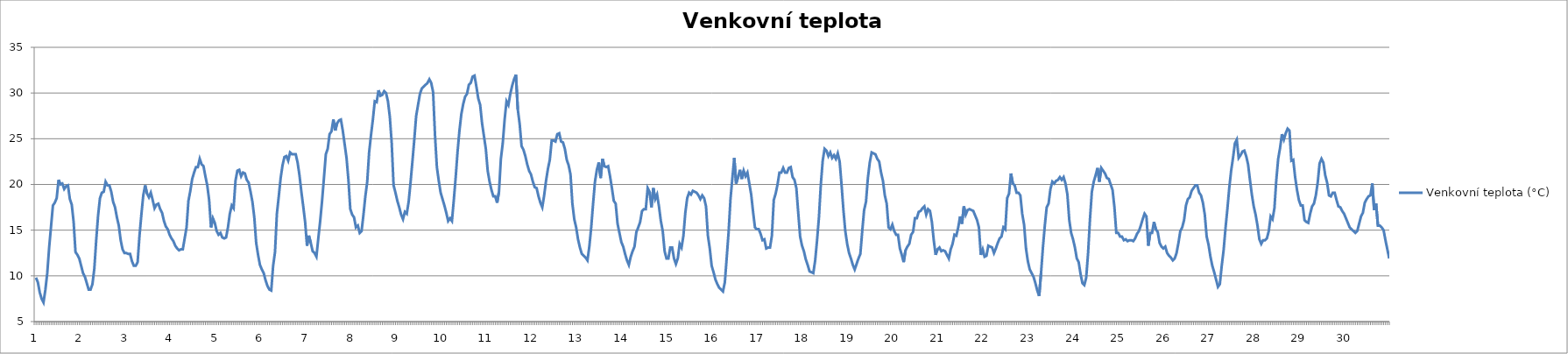
| Category | Venkovní teplota (°C) |
|---|---|
| 0 | 9.8 |
| 1 | 9.3 |
| 2 | 8.2 |
| 3 | 7.5 |
| 4 | 7.1 |
| 5 | 8.5 |
| 6 | 10.3 |
| 7 | 13.1 |
| 8 | 15.4 |
| 9 | 17.7 |
| 10 | 18 |
| 11 | 18.5 |
| 12 | 20.5 |
| 13 | 20 |
| 14 | 20.1 |
| 15 | 19.5 |
| 16 | 19.8 |
| 17 | 19.9 |
| 18 | 18.4 |
| 19 | 17.8 |
| 20 | 15.9 |
| 21 | 12.6 |
| 22 | 12.3 |
| 23 | 11.9 |
| 24 | 11.1 |
| 25 | 10.3 |
| 26 | 9.9 |
| 27 | 9.2 |
| 28 | 8.5 |
| 29 | 8.5 |
| 30 | 9.1 |
| 31 | 10.8 |
| 32 | 13.9 |
| 33 | 16.6 |
| 34 | 18.5 |
| 35 | 19.1 |
| 36 | 19.2 |
| 37 | 20.3 |
| 38 | 19.9 |
| 39 | 19.9 |
| 40 | 19.2 |
| 41 | 18.1 |
| 42 | 17.5 |
| 43 | 16.4 |
| 44 | 15.5 |
| 45 | 13.9 |
| 46 | 12.9 |
| 47 | 12.5 |
| 48 | 12.5 |
| 49 | 12.4 |
| 50 | 12.4 |
| 51 | 11.6 |
| 52 | 11.1 |
| 53 | 11.1 |
| 54 | 11.5 |
| 55 | 14.4 |
| 56 | 16.7 |
| 57 | 18.8 |
| 58 | 19.9 |
| 59 | 19 |
| 60 | 18.6 |
| 61 | 19.1 |
| 62 | 18.3 |
| 63 | 17.4 |
| 64 | 17.8 |
| 65 | 17.9 |
| 66 | 17.3 |
| 67 | 16.9 |
| 68 | 16 |
| 69 | 15.4 |
| 70 | 15.1 |
| 71 | 14.5 |
| 72 | 14.1 |
| 73 | 13.8 |
| 74 | 13.3 |
| 75 | 13 |
| 76 | 12.8 |
| 77 | 12.9 |
| 78 | 12.9 |
| 79 | 14.1 |
| 80 | 15.3 |
| 81 | 18.2 |
| 82 | 19.3 |
| 83 | 20.6 |
| 84 | 21.3 |
| 85 | 21.9 |
| 86 | 21.9 |
| 87 | 22.8 |
| 88 | 22.2 |
| 89 | 22 |
| 90 | 20.9 |
| 91 | 19.9 |
| 92 | 18.3 |
| 93 | 15.3 |
| 94 | 16.3 |
| 95 | 15.8 |
| 96 | 14.9 |
| 97 | 14.5 |
| 98 | 14.7 |
| 99 | 14.2 |
| 100 | 14.1 |
| 101 | 14.2 |
| 102 | 15.3 |
| 103 | 16.8 |
| 104 | 17.7 |
| 105 | 17.4 |
| 106 | 20.4 |
| 107 | 21.5 |
| 108 | 21.6 |
| 109 | 20.9 |
| 110 | 21.3 |
| 111 | 21.2 |
| 112 | 20.5 |
| 113 | 20.2 |
| 114 | 19.2 |
| 115 | 18.1 |
| 116 | 16.4 |
| 117 | 13.6 |
| 118 | 12.3 |
| 119 | 11.2 |
| 120 | 10.7 |
| 121 | 10.3 |
| 122 | 9.5 |
| 123 | 8.9 |
| 124 | 8.5 |
| 125 | 8.4 |
| 126 | 11.1 |
| 127 | 12.6 |
| 128 | 16.8 |
| 129 | 18.7 |
| 130 | 20.7 |
| 131 | 22.1 |
| 132 | 23 |
| 133 | 23.1 |
| 134 | 22.6 |
| 135 | 23.5 |
| 136 | 23.3 |
| 137 | 23.3 |
| 138 | 23.3 |
| 139 | 22.4 |
| 140 | 21 |
| 141 | 19.2 |
| 142 | 17.6 |
| 143 | 15.9 |
| 144 | 13.3 |
| 145 | 14.4 |
| 146 | 13.6 |
| 147 | 12.7 |
| 148 | 12.5 |
| 149 | 12.1 |
| 150 | 14.1 |
| 151 | 16 |
| 152 | 18.2 |
| 153 | 20.7 |
| 154 | 23.3 |
| 155 | 23.9 |
| 156 | 25.5 |
| 157 | 25.8 |
| 158 | 27.1 |
| 159 | 25.9 |
| 160 | 26.7 |
| 161 | 27 |
| 162 | 27.1 |
| 163 | 25.9 |
| 164 | 24.4 |
| 165 | 22.9 |
| 166 | 20.5 |
| 167 | 17.3 |
| 168 | 16.7 |
| 169 | 16.4 |
| 170 | 15.3 |
| 171 | 15.5 |
| 172 | 14.7 |
| 173 | 14.9 |
| 174 | 16.7 |
| 175 | 18.7 |
| 176 | 20.3 |
| 177 | 23.5 |
| 178 | 25.4 |
| 179 | 27.1 |
| 180 | 29.1 |
| 181 | 29 |
| 182 | 30.3 |
| 183 | 29.7 |
| 184 | 29.8 |
| 185 | 30.2 |
| 186 | 30 |
| 187 | 29.1 |
| 188 | 27.4 |
| 189 | 24.5 |
| 190 | 19.9 |
| 191 | 19.1 |
| 192 | 18.2 |
| 193 | 17.5 |
| 194 | 16.7 |
| 195 | 16.2 |
| 196 | 17 |
| 197 | 16.8 |
| 198 | 18.1 |
| 199 | 20.2 |
| 200 | 22.5 |
| 201 | 24.9 |
| 202 | 27.5 |
| 203 | 28.7 |
| 204 | 29.9 |
| 205 | 30.5 |
| 206 | 30.7 |
| 207 | 30.9 |
| 208 | 31.1 |
| 209 | 31.5 |
| 210 | 31.1 |
| 211 | 30.1 |
| 212 | 25.4 |
| 213 | 21.9 |
| 214 | 20.4 |
| 215 | 19.1 |
| 216 | 18.4 |
| 217 | 17.7 |
| 218 | 16.9 |
| 219 | 16 |
| 220 | 16.3 |
| 221 | 16 |
| 222 | 18.3 |
| 223 | 20.8 |
| 224 | 23.6 |
| 225 | 25.9 |
| 226 | 27.7 |
| 227 | 28.8 |
| 228 | 29.6 |
| 229 | 29.9 |
| 230 | 30.9 |
| 231 | 31.1 |
| 232 | 31.8 |
| 233 | 31.9 |
| 234 | 30.7 |
| 235 | 29.4 |
| 236 | 28.7 |
| 237 | 26.7 |
| 238 | 25.3 |
| 239 | 23.9 |
| 240 | 21.5 |
| 241 | 20.3 |
| 242 | 19.4 |
| 243 | 18.7 |
| 244 | 18.7 |
| 245 | 18 |
| 246 | 19.2 |
| 247 | 22.8 |
| 248 | 24.5 |
| 249 | 27.1 |
| 250 | 29.1 |
| 251 | 28.7 |
| 252 | 29.9 |
| 253 | 30.8 |
| 254 | 31.5 |
| 255 | 32 |
| 256 | 28.2 |
| 257 | 26.6 |
| 258 | 24.2 |
| 259 | 23.8 |
| 260 | 23.1 |
| 261 | 22.2 |
| 262 | 21.5 |
| 263 | 21.1 |
| 264 | 20.3 |
| 265 | 19.7 |
| 266 | 19.6 |
| 267 | 18.7 |
| 268 | 18 |
| 269 | 17.5 |
| 270 | 18.8 |
| 271 | 20.4 |
| 272 | 21.7 |
| 273 | 22.7 |
| 274 | 24.8 |
| 275 | 24.8 |
| 276 | 24.7 |
| 277 | 25.5 |
| 278 | 25.6 |
| 279 | 24.7 |
| 280 | 24.6 |
| 281 | 23.9 |
| 282 | 22.7 |
| 283 | 22.1 |
| 284 | 21.1 |
| 285 | 17.9 |
| 286 | 16.2 |
| 287 | 15.3 |
| 288 | 14 |
| 289 | 13.1 |
| 290 | 12.4 |
| 291 | 12.2 |
| 292 | 12 |
| 293 | 11.7 |
| 294 | 13.2 |
| 295 | 15.3 |
| 296 | 17.9 |
| 297 | 20.3 |
| 298 | 21.6 |
| 299 | 22.4 |
| 300 | 20.7 |
| 301 | 22.8 |
| 302 | 22 |
| 303 | 21.9 |
| 304 | 22 |
| 305 | 20.9 |
| 306 | 19.6 |
| 307 | 18.2 |
| 308 | 17.9 |
| 309 | 15.7 |
| 310 | 14.7 |
| 311 | 13.7 |
| 312 | 13.2 |
| 313 | 12.4 |
| 314 | 11.7 |
| 315 | 11.2 |
| 316 | 12.1 |
| 317 | 12.7 |
| 318 | 13.2 |
| 319 | 14.8 |
| 320 | 15.3 |
| 321 | 15.9 |
| 322 | 17.1 |
| 323 | 17.3 |
| 324 | 17.3 |
| 325 | 19.6 |
| 326 | 19.2 |
| 327 | 17.5 |
| 328 | 19.6 |
| 329 | 18.4 |
| 330 | 18.9 |
| 331 | 17.6 |
| 332 | 16 |
| 333 | 14.9 |
| 334 | 12.7 |
| 335 | 11.9 |
| 336 | 11.9 |
| 337 | 13.1 |
| 338 | 13.1 |
| 339 | 11.9 |
| 340 | 11.3 |
| 341 | 11.9 |
| 342 | 13.5 |
| 343 | 13.1 |
| 344 | 14.4 |
| 345 | 16.9 |
| 346 | 18.5 |
| 347 | 19.1 |
| 348 | 18.9 |
| 349 | 19.3 |
| 350 | 19.2 |
| 351 | 19.1 |
| 352 | 18.8 |
| 353 | 18.4 |
| 354 | 18.8 |
| 355 | 18.5 |
| 356 | 17.6 |
| 357 | 14.4 |
| 358 | 13 |
| 359 | 11.1 |
| 360 | 10.4 |
| 361 | 9.6 |
| 362 | 9.1 |
| 363 | 8.7 |
| 364 | 8.5 |
| 365 | 8.3 |
| 366 | 9.3 |
| 367 | 12 |
| 368 | 14.8 |
| 369 | 18.4 |
| 370 | 20.7 |
| 371 | 22.9 |
| 372 | 20.1 |
| 373 | 20.8 |
| 374 | 21.6 |
| 375 | 20.6 |
| 376 | 21.5 |
| 377 | 20.9 |
| 378 | 21.3 |
| 379 | 20.1 |
| 380 | 18.9 |
| 381 | 17 |
| 382 | 15.3 |
| 383 | 15.1 |
| 384 | 15.1 |
| 385 | 14.6 |
| 386 | 13.9 |
| 387 | 14 |
| 388 | 13 |
| 389 | 13.1 |
| 390 | 13.1 |
| 391 | 14.4 |
| 392 | 18.3 |
| 393 | 19 |
| 394 | 20 |
| 395 | 21.3 |
| 396 | 21.3 |
| 397 | 21.8 |
| 398 | 21.3 |
| 399 | 21.3 |
| 400 | 21.8 |
| 401 | 21.9 |
| 402 | 20.8 |
| 403 | 20.5 |
| 404 | 19.6 |
| 405 | 16.9 |
| 406 | 14.3 |
| 407 | 13.3 |
| 408 | 12.7 |
| 409 | 11.8 |
| 410 | 11.2 |
| 411 | 10.5 |
| 412 | 10.4 |
| 413 | 10.3 |
| 414 | 11.7 |
| 415 | 13.9 |
| 416 | 16.4 |
| 417 | 20 |
| 418 | 22.6 |
| 419 | 23.9 |
| 420 | 23.7 |
| 421 | 23.1 |
| 422 | 23.5 |
| 423 | 22.9 |
| 424 | 23.2 |
| 425 | 22.8 |
| 426 | 23.4 |
| 427 | 22.5 |
| 428 | 20 |
| 429 | 17.2 |
| 430 | 14.9 |
| 431 | 13.5 |
| 432 | 12.5 |
| 433 | 11.9 |
| 434 | 11.2 |
| 435 | 10.7 |
| 436 | 11.3 |
| 437 | 11.9 |
| 438 | 12.4 |
| 439 | 14.9 |
| 440 | 17.2 |
| 441 | 18.1 |
| 442 | 20.7 |
| 443 | 22.4 |
| 444 | 23.5 |
| 445 | 23.4 |
| 446 | 23.3 |
| 447 | 22.8 |
| 448 | 22.5 |
| 449 | 21.3 |
| 450 | 20.4 |
| 451 | 18.8 |
| 452 | 17.9 |
| 453 | 15.3 |
| 454 | 15.1 |
| 455 | 15.6 |
| 456 | 14.9 |
| 457 | 14.5 |
| 458 | 14.5 |
| 459 | 13 |
| 460 | 12.3 |
| 461 | 11.5 |
| 462 | 12.8 |
| 463 | 13.2 |
| 464 | 13.5 |
| 465 | 14.5 |
| 466 | 14.8 |
| 467 | 16.3 |
| 468 | 16.3 |
| 469 | 17 |
| 470 | 17.1 |
| 471 | 17.4 |
| 472 | 17.6 |
| 473 | 16.7 |
| 474 | 17.3 |
| 475 | 17.1 |
| 476 | 15.9 |
| 477 | 13.9 |
| 478 | 12.3 |
| 479 | 12.9 |
| 480 | 13.1 |
| 481 | 12.7 |
| 482 | 12.8 |
| 483 | 12.7 |
| 484 | 12.3 |
| 485 | 11.9 |
| 486 | 12.9 |
| 487 | 13.5 |
| 488 | 14.5 |
| 489 | 14.4 |
| 490 | 15.3 |
| 491 | 16.5 |
| 492 | 15.7 |
| 493 | 17.6 |
| 494 | 16.7 |
| 495 | 17.2 |
| 496 | 17.3 |
| 497 | 17.2 |
| 498 | 17.1 |
| 499 | 16.6 |
| 500 | 16.1 |
| 501 | 15.3 |
| 502 | 12.3 |
| 503 | 12.9 |
| 504 | 12.1 |
| 505 | 12.2 |
| 506 | 13.3 |
| 507 | 13.2 |
| 508 | 13.1 |
| 509 | 12.5 |
| 510 | 13 |
| 511 | 13.6 |
| 512 | 14.1 |
| 513 | 14.3 |
| 514 | 15.3 |
| 515 | 15.1 |
| 516 | 18.5 |
| 517 | 19 |
| 518 | 21.2 |
| 519 | 20.1 |
| 520 | 19.9 |
| 521 | 19.1 |
| 522 | 19.1 |
| 523 | 18.8 |
| 524 | 16.8 |
| 525 | 15.6 |
| 526 | 13 |
| 527 | 11.6 |
| 528 | 10.7 |
| 529 | 10.3 |
| 530 | 9.9 |
| 531 | 9.2 |
| 532 | 8.4 |
| 533 | 7.8 |
| 534 | 10.3 |
| 535 | 13.1 |
| 536 | 15.5 |
| 537 | 17.5 |
| 538 | 17.9 |
| 539 | 19.5 |
| 540 | 20.3 |
| 541 | 20.1 |
| 542 | 20.4 |
| 543 | 20.5 |
| 544 | 20.8 |
| 545 | 20.5 |
| 546 | 20.8 |
| 547 | 20.1 |
| 548 | 18.9 |
| 549 | 16.1 |
| 550 | 14.7 |
| 551 | 14 |
| 552 | 13.1 |
| 553 | 11.9 |
| 554 | 11.5 |
| 555 | 10.2 |
| 556 | 9.2 |
| 557 | 9 |
| 558 | 9.8 |
| 559 | 12.5 |
| 560 | 16.2 |
| 561 | 19.2 |
| 562 | 20.3 |
| 563 | 21 |
| 564 | 21.8 |
| 565 | 20.3 |
| 566 | 21.8 |
| 567 | 21.5 |
| 568 | 21.2 |
| 569 | 20.7 |
| 570 | 20.6 |
| 571 | 20 |
| 572 | 19.4 |
| 573 | 17.5 |
| 574 | 14.7 |
| 575 | 14.7 |
| 576 | 14.3 |
| 577 | 14.3 |
| 578 | 13.9 |
| 579 | 14 |
| 580 | 13.8 |
| 581 | 13.9 |
| 582 | 13.9 |
| 583 | 13.8 |
| 584 | 14.1 |
| 585 | 14.6 |
| 586 | 14.9 |
| 587 | 15.5 |
| 588 | 16.2 |
| 589 | 16.8 |
| 590 | 16.5 |
| 591 | 13.3 |
| 592 | 14.7 |
| 593 | 14.7 |
| 594 | 15.9 |
| 595 | 15.1 |
| 596 | 14.8 |
| 597 | 13.6 |
| 598 | 13.2 |
| 599 | 13 |
| 600 | 13.2 |
| 601 | 12.5 |
| 602 | 12.2 |
| 603 | 12 |
| 604 | 11.7 |
| 605 | 11.9 |
| 606 | 12.5 |
| 607 | 13.6 |
| 608 | 14.9 |
| 609 | 15.3 |
| 610 | 16.1 |
| 611 | 17.7 |
| 612 | 18.4 |
| 613 | 18.6 |
| 614 | 19.3 |
| 615 | 19.6 |
| 616 | 19.9 |
| 617 | 19.9 |
| 618 | 19.1 |
| 619 | 18.8 |
| 620 | 18 |
| 621 | 16.7 |
| 622 | 14.3 |
| 623 | 13.4 |
| 624 | 12.1 |
| 625 | 11.1 |
| 626 | 10.4 |
| 627 | 9.6 |
| 628 | 8.8 |
| 629 | 9.1 |
| 630 | 11.1 |
| 631 | 12.8 |
| 632 | 15.2 |
| 633 | 17.3 |
| 634 | 19.6 |
| 635 | 21.5 |
| 636 | 22.9 |
| 637 | 24.5 |
| 638 | 24.9 |
| 639 | 22.9 |
| 640 | 23.2 |
| 641 | 23.6 |
| 642 | 23.7 |
| 643 | 23.1 |
| 644 | 22.2 |
| 645 | 20.5 |
| 646 | 18.9 |
| 647 | 17.6 |
| 648 | 16.7 |
| 649 | 15.5 |
| 650 | 14 |
| 651 | 13.5 |
| 652 | 13.9 |
| 653 | 13.9 |
| 654 | 14.1 |
| 655 | 14.9 |
| 656 | 16.5 |
| 657 | 16.2 |
| 658 | 17.4 |
| 659 | 20.5 |
| 660 | 22.8 |
| 661 | 24 |
| 662 | 25.5 |
| 663 | 24.9 |
| 664 | 25.6 |
| 665 | 26.1 |
| 666 | 25.9 |
| 667 | 22.6 |
| 668 | 22.7 |
| 669 | 20.8 |
| 670 | 19.4 |
| 671 | 18.3 |
| 672 | 17.7 |
| 673 | 17.7 |
| 674 | 16.1 |
| 675 | 15.9 |
| 676 | 15.8 |
| 677 | 16.8 |
| 678 | 17.6 |
| 679 | 17.9 |
| 680 | 18.8 |
| 681 | 20.2 |
| 682 | 22.3 |
| 683 | 22.8 |
| 684 | 22.4 |
| 685 | 21 |
| 686 | 20.2 |
| 687 | 18.8 |
| 688 | 18.7 |
| 689 | 19.1 |
| 690 | 19.1 |
| 691 | 18.3 |
| 692 | 17.6 |
| 693 | 17.5 |
| 694 | 17.1 |
| 695 | 16.8 |
| 696 | 16.3 |
| 697 | 15.8 |
| 698 | 15.3 |
| 699 | 15.1 |
| 700 | 14.9 |
| 701 | 14.7 |
| 702 | 14.9 |
| 703 | 15.7 |
| 704 | 16.5 |
| 705 | 16.9 |
| 706 | 18 |
| 707 | 18.4 |
| 708 | 18.7 |
| 709 | 18.8 |
| 710 | 20.1 |
| 711 | 17.2 |
| 712 | 17.9 |
| 713 | 15.5 |
| 714 | 15.5 |
| 715 | 15.3 |
| 716 | 15 |
| 717 | 13.9 |
| 718 | 12.9 |
| 719 | 11.9 |